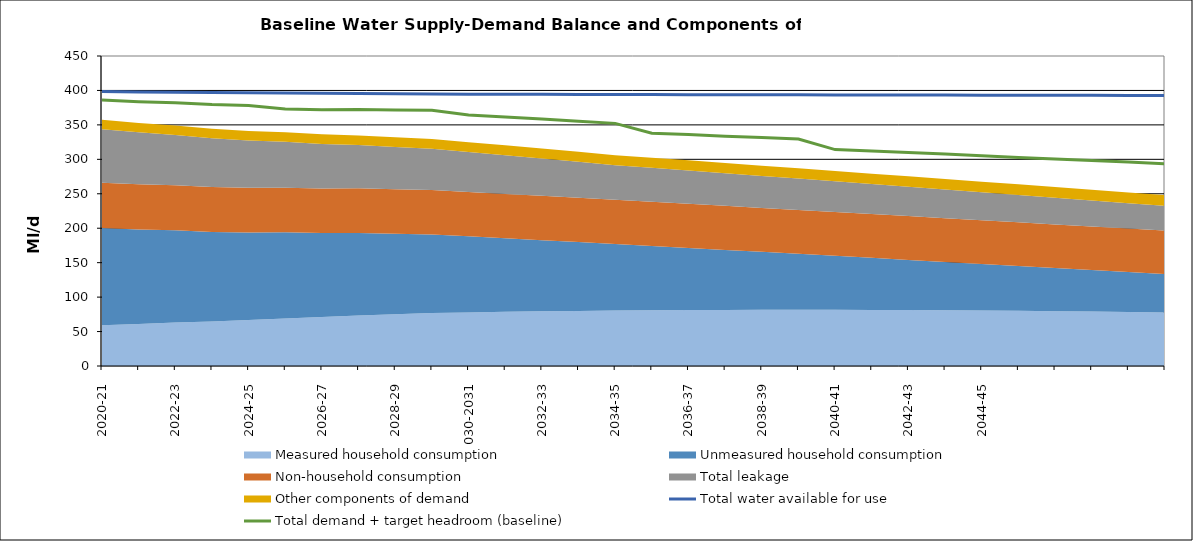
| Category | Total water available for use | Total demand + target headroom (baseline) |
|---|---|---|
| 0 | 398.29 | 385.964 |
| 1 | 397.902 | 383.76 |
| 2 | 397.514 | 382.183 |
| 3 | 397.126 | 379.482 |
| 4 | 396.738 | 378.289 |
| 5 | 396.35 | 373.207 |
| 6 | 395.962 | 371.923 |
| 7 | 395.574 | 372.484 |
| 8 | 395.186 | 371.726 |
| 9 | 394.798 | 371.133 |
| 10 | 394.507 | 364.405 |
| 11 | 394.41 | 361.397 |
| 12 | 394.313 | 358.546 |
| 13 | 394.216 | 355.335 |
| 14 | 394.119 | 352.198 |
| 15 | 394.022 | 337.931 |
| 16 | 393.925 | 335.898 |
| 17 | 393.829 | 333.665 |
| 18 | 393.732 | 331.557 |
| 19 | 393.635 | 329.571 |
| 20 | 393.538 | 314.16 |
| 21 | 393.441 | 312.163 |
| 22 | 393.344 | 309.848 |
| 23 | 393.247 | 307.644 |
| 24 | 393.15 | 305.143 |
| 25 | 393.053 | 302.584 |
| 26 | 392.956 | 300.576 |
| 27 | 392.859 | 298.402 |
| 28 | 392.762 | 296.043 |
| 29 | 392.665 | 293.649 |